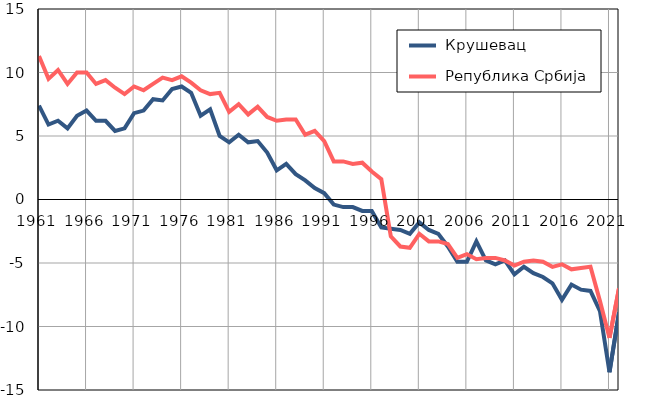
| Category |  Крушевац |  Република Србија |
|---|---|---|
| 1961.0 | 7.4 | 11.3 |
| 1962.0 | 5.9 | 9.5 |
| 1963.0 | 6.2 | 10.2 |
| 1964.0 | 5.6 | 9.1 |
| 1965.0 | 6.6 | 10 |
| 1966.0 | 7 | 10 |
| 1967.0 | 6.2 | 9.1 |
| 1968.0 | 6.2 | 9.4 |
| 1969.0 | 5.4 | 8.8 |
| 1970.0 | 5.6 | 8.3 |
| 1971.0 | 6.8 | 8.9 |
| 1972.0 | 7 | 8.6 |
| 1973.0 | 7.9 | 9.1 |
| 1974.0 | 7.8 | 9.6 |
| 1975.0 | 8.7 | 9.4 |
| 1976.0 | 8.9 | 9.7 |
| 1977.0 | 8.4 | 9.2 |
| 1978.0 | 6.6 | 8.6 |
| 1979.0 | 7.1 | 8.3 |
| 1980.0 | 5 | 8.4 |
| 1981.0 | 4.5 | 6.9 |
| 1982.0 | 5.1 | 7.5 |
| 1983.0 | 4.5 | 6.7 |
| 1984.0 | 4.6 | 7.3 |
| 1985.0 | 3.7 | 6.5 |
| 1986.0 | 2.3 | 6.2 |
| 1987.0 | 2.8 | 6.3 |
| 1988.0 | 2 | 6.3 |
| 1989.0 | 1.5 | 5.1 |
| 1990.0 | 0.9 | 5.4 |
| 1991.0 | 0.5 | 4.6 |
| 1992.0 | -0.4 | 3 |
| 1993.0 | -0.6 | 3 |
| 1994.0 | -0.6 | 2.8 |
| 1995.0 | -0.9 | 2.9 |
| 1996.0 | -0.9 | 2.2 |
| 1997.0 | -2.2 | 1.6 |
| 1998.0 | -2.3 | -2.9 |
| 1999.0 | -2.4 | -3.7 |
| 2000.0 | -2.7 | -3.8 |
| 2001.0 | -1.8 | -2.7 |
| 2002.0 | -2.4 | -3.3 |
| 2003.0 | -2.7 | -3.3 |
| 2004.0 | -3.7 | -3.5 |
| 2005.0 | -4.9 | -4.6 |
| 2006.0 | -4.9 | -4.3 |
| 2007.0 | -3.3 | -4.7 |
| 2008.0 | -4.8 | -4.6 |
| 2009.0 | -5.1 | -4.6 |
| 2010.0 | -4.8 | -4.8 |
| 2011.0 | -5.9 | -5.2 |
| 2012.0 | -5.3 | -4.9 |
| 2013.0 | -5.8 | -4.8 |
| 2014.0 | -6.1 | -4.9 |
| 2015.0 | -6.6 | -5.3 |
| 2016.0 | -7.9 | -5.1 |
| 2017.0 | -6.7 | -5.5 |
| 2018.0 | -7.1 | -5.4 |
| 2019.0 | -7.2 | -5.3 |
| 2020.0 | -8.8 | -8 |
| 2021.0 | -13.6 | -10.9 |
| 2022.0 | -8.9 | -7 |